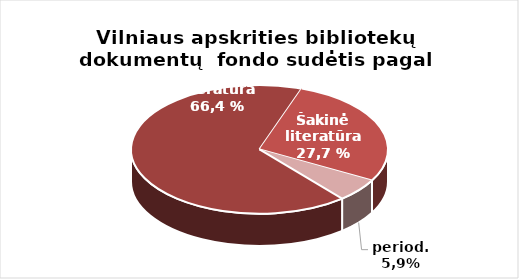
| Category | Series 0 |
|---|---|
| Grožinė literatūra* | 1207520 |
| Šakinė literatūra* | 503788 |
| period. | 106045 |